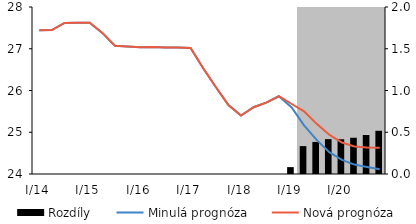
| Category | Rozdíly |
|---|---|
| 0 | 0 |
| 1 | 0 |
| 2 | 0 |
| 3 | 0 |
| 4 | 0 |
| 5 | 0 |
| 6 | 0 |
| 7 | 0 |
| 8 | 0 |
| 9 | 0 |
| 10 | 0 |
| 11 | 0 |
| 12 | 0 |
| 13 | 0 |
| 14 | 0 |
| 15 | 0 |
| 16 | 0 |
| 17 | 0 |
| 18 | 0 |
| 19 | 0 |
| 20 | 0.082 |
| 21 | 0.334 |
| 22 | 0.384 |
| 23 | 0.417 |
| 24 | 0.416 |
| 25 | 0.434 |
| 26 | 0.467 |
| 27 | 0.517 |